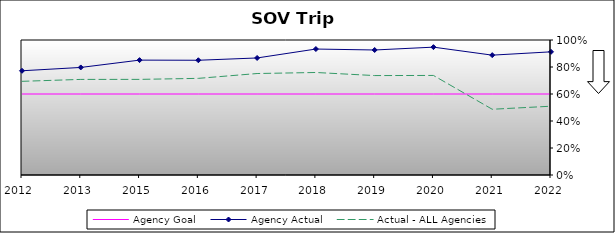
| Category | Agency Goal | Agency Actual | Actual - ALL Agencies |
|---|---|---|---|
| 2012.0 | 0.6 | 0.772 | 0.694 |
| 2013.0 | 0.6 | 0.797 | 0.708 |
| 2015.0 | 0.6 | 0.851 | 0.708 |
| 2016.0 | 0.6 | 0.85 | 0.716 |
| 2017.0 | 0.6 | 0.867 | 0.752 |
| 2018.0 | 0.6 | 0.933 | 0.759 |
| 2019.0 | 0.6 | 0.926 | 0.736 |
| 2020.0 | 0.6 | 0.947 | 0.737 |
| 2021.0 | 0.6 | 0.888 | 0.487 |
| 2022.0 | 0.6 | 0.912 | 0.509 |